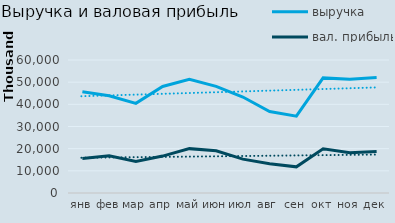
| Category | выручка | вал. прибыль |
|---|---|---|
| янв | 45648000 | 15528960 |
| фев | 43886854.512 | 16842256.06 |
| мар | 40449089.025 | 14265193.656 |
| апр | 48063035.194 | 16652601.588 |
| май | 51309222.108 | 20012841.761 |
| июн | 48082262.331 | 19053471.574 |
| июл | 43306498.766 | 15274168.529 |
| авг | 36790501.54 | 13204982.158 |
| сен | 34654295.001 | 11791173.857 |
| окт | 51932283.419 | 19932696.188 |
| ноя | 51370823.969 | 18118507.351 |
| дек | 52072216.8 | 18690009.403 |